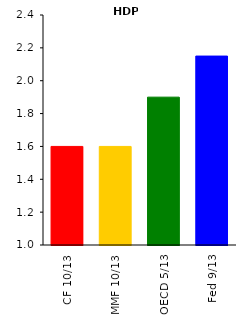
| Category | HDP |
|---|---|
| CF 10/13 | 1.6 |
| MMF 10/13 | 1.6 |
| OECD 5/13 | 1.9 |
| Fed 9/13 | 2.15 |